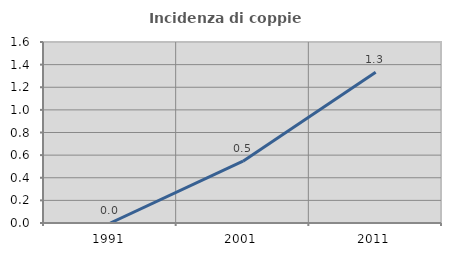
| Category | Incidenza di coppie miste |
|---|---|
| 1991.0 | 0 |
| 2001.0 | 0.546 |
| 2011.0 | 1.333 |